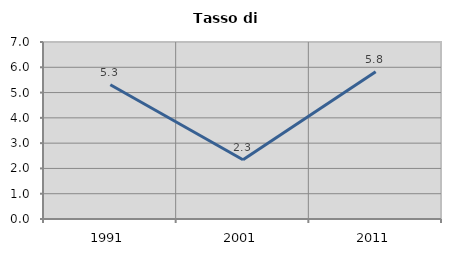
| Category | Tasso di disoccupazione   |
|---|---|
| 1991.0 | 5.307 |
| 2001.0 | 2.341 |
| 2011.0 | 5.821 |